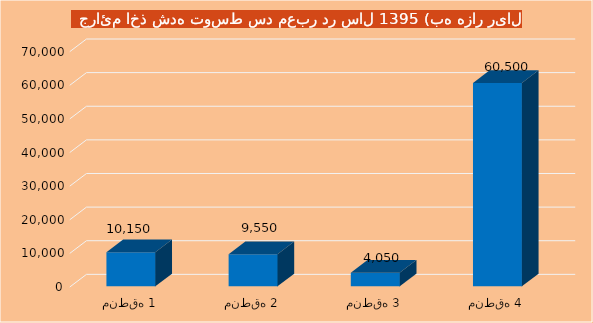
| Category | Series 0 |
|---|---|
| منطقه 1 | 10150 |
| منطقه 2 | 9550 |
| منطقه 3 | 4050 |
| منطقه 4 | 60500 |